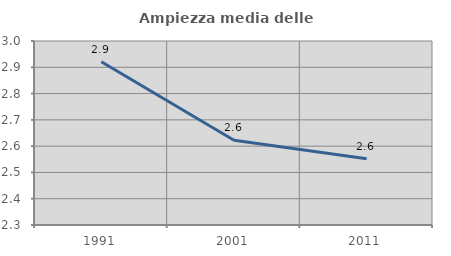
| Category | Ampiezza media delle famiglie |
|---|---|
| 1991.0 | 2.921 |
| 2001.0 | 2.622 |
| 2011.0 | 2.552 |